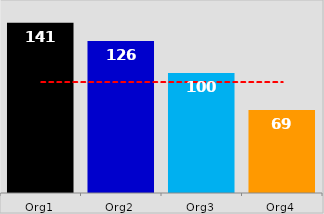
| Category | KPI / Metric |
|---|---|
| Org1 | 141.083 |
| Org2 | 125.917 |
| Org3 | 99.583 |
| Org4 | 68.75 |